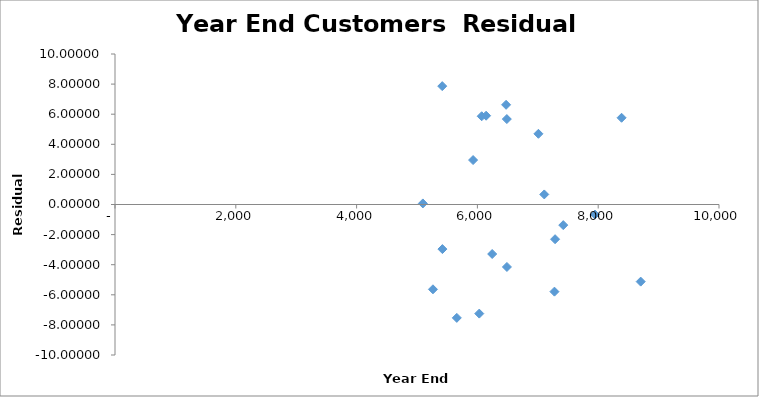
| Category | Series 0 |
|---|---|
| 7946.5 | -0.668 |
| 7421.5 | -1.37 |
| 5418.0 | 7.865 |
| 7010.5 | 4.698 |
| 6245.0 | -3.29 |
| 5659.0 | -7.534 |
| 6489.0 | -4.151 |
| 6487.0 | 5.677 |
| 6071.5 | 5.863 |
| 6031.0 | -7.25 |
| 6144.0 | 5.9 |
| 5420.5 | -2.963 |
| 5928.5 | 2.953 |
| 5097.0 | 0.071 |
| 8387.0 | 5.762 |
| 7286.0 | -2.306 |
| 7275.5 | -5.791 |
| 5264.0 | -5.635 |
| 6475.0 | 6.624 |
| 7107.099999999999 | 0.668 |
| 8703.5 | -5.124 |